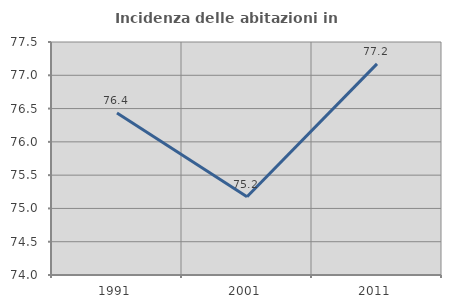
| Category | Incidenza delle abitazioni in proprietà  |
|---|---|
| 1991.0 | 76.434 |
| 2001.0 | 75.175 |
| 2011.0 | 77.171 |